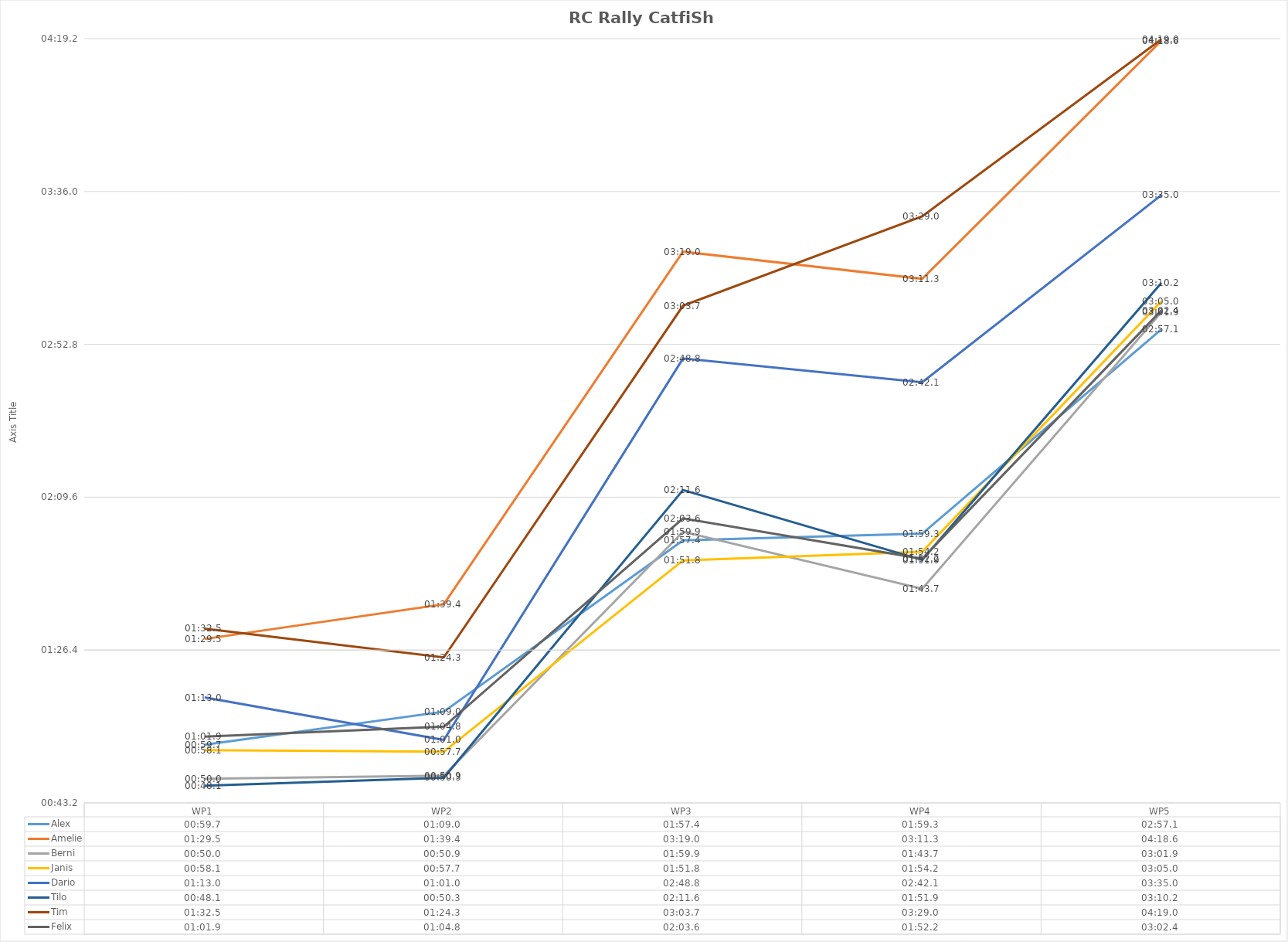
| Category | Alex | Amelie | Berni | Janis | Dario | Tilo | Tim | Felix |
|---|---|---|---|---|---|---|---|---|
| WP1 | 0.001 | 0.001 | 0.001 | 0.001 | 0.001 | 0.001 | 0.001 | 0.001 |
| WP2 | 0.001 | 0.001 | 0.001 | 0.001 | 0.001 | 0.001 | 0.001 | 0.001 |
| WP3 | 0.001 | 0.002 | 0.001 | 0.001 | 0.002 | 0.002 | 0.002 | 0.001 |
| WP4 | 0.001 | 0.002 | 0.001 | 0.001 | 0.002 | 0.001 | 0.002 | 0.001 |
| WP5 | 0.002 | 0.003 | 0.002 | 0.002 | 0.002 | 0.002 | 0.003 | 0.002 |